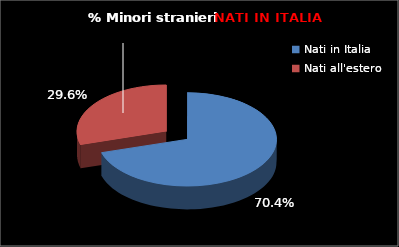
| Category | Series 0 |
|---|---|
| Nati in Italia | 283 |
| Nati all'estero | 119 |